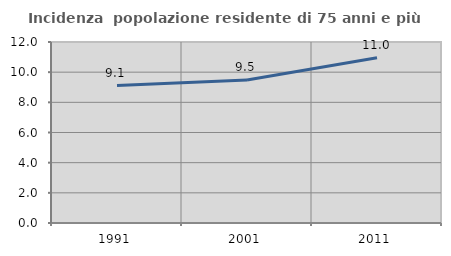
| Category | Incidenza  popolazione residente di 75 anni e più |
|---|---|
| 1991.0 | 9.109 |
| 2001.0 | 9.484 |
| 2011.0 | 10.96 |